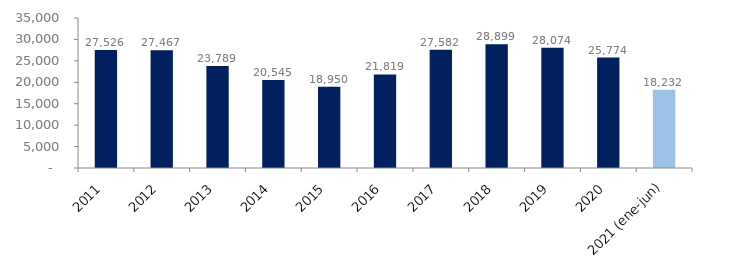
| Category | Series 1 |
|---|---|
| 2011 | 27525.675 |
| 2012 | 27466.673 |
| 2013 | 23789.445 |
| 2014 | 20545.414 |
| 2015 | 18950.14 |
| 2016 | 21819.079 |
| 2017 | 27581.607 |
| 2018 | 28898.658 |
| 2019 | 28073.793 |
| 2020 | 25773.552 |
| 2021 (ene-jun) | 18231.776 |